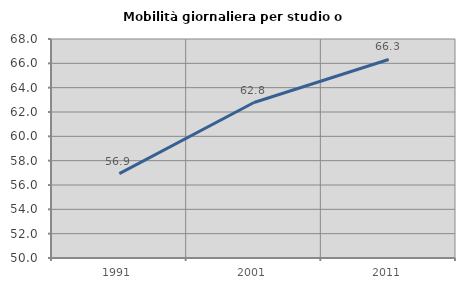
| Category | Mobilità giornaliera per studio o lavoro |
|---|---|
| 1991.0 | 56.932 |
| 2001.0 | 62.778 |
| 2011.0 | 66.318 |